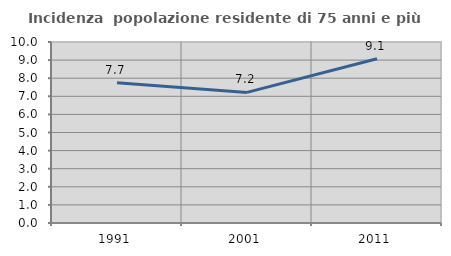
| Category | Incidenza  popolazione residente di 75 anni e più |
|---|---|
| 1991.0 | 7.747 |
| 2001.0 | 7.216 |
| 2011.0 | 9.076 |